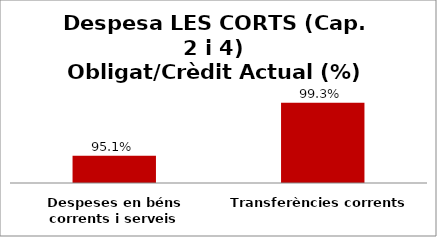
| Category | Series 0 |
|---|---|
| Despeses en béns corrents i serveis | 0.951 |
| Transferències corrents | 0.993 |